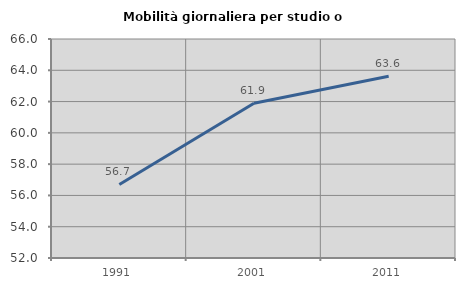
| Category | Mobilità giornaliera per studio o lavoro |
|---|---|
| 1991.0 | 56.702 |
| 2001.0 | 61.891 |
| 2011.0 | 63.616 |